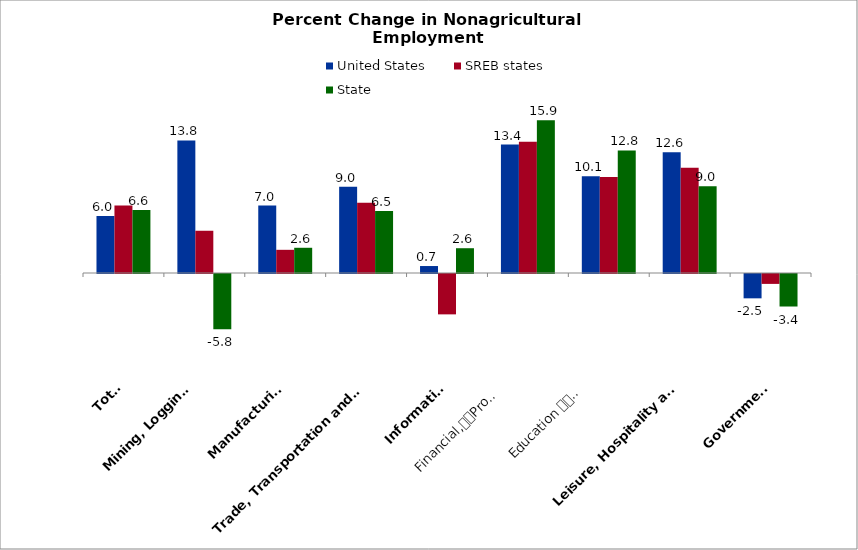
| Category | United States | SREB states | State |
|---|---|---|---|
| Total | 5.95 | 7.021 | 6.551 |
| Mining, Logging 
and Construction | 13.811 | 4.401 | -5.765 |
| Manufacturing | 7.03 | 2.415 | 2.627 |
| Trade, Transportation and Utilities | 8.976 | 7.312 | 6.46 |
| Information | 0.726 | -4.205 | 2.581 |
| Financial,
Professional and 
Business Services | 13.373 | 13.676 | 15.913 |
| Education 
and 
Health Services | 10.07 | 9.998 | 12.769 |
| Leisure, Hospitality and 
Other Services | 12.582 | 10.952 | 9.03 |
| Government | -2.535 | -1.031 | -3.386 |